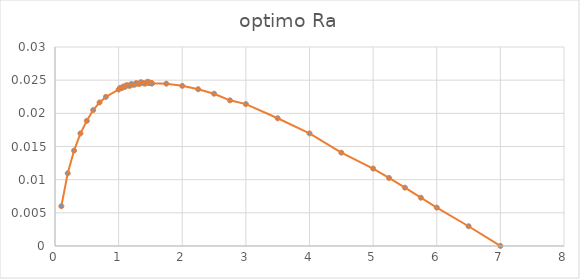
| Category | optimo Ra |
|---|---|
| 0.1 | 0.006 |
| 0.2 | 0.011 |
| 0.3 | 0.014 |
| 0.4 | 0.017 |
| 0.5 | 0.019 |
| 0.6 | 0.02 |
| 0.7 | 0.022 |
| 0.8 | 0.022 |
| 1.0 | 0.024 |
| 1.025 | 0.024 |
| 1.05 | 0.024 |
| 1.075 | 0.024 |
| 1.1 | 0.024 |
| 1.125 | 0.024 |
| 1.15 | 0.024 |
| 1.175 | 0.024 |
| 1.2 | 0.024 |
| 1.225 | 0.024 |
| 1.25 | 0.024 |
| 1.275 | 0.025 |
| 1.3 | 0.024 |
| 1.325 | 0.024 |
| 1.35 | 0.025 |
| 1.375 | 0.025 |
| 1.4 | 0.024 |
| 1.425 | 0.024 |
| 1.45 | 0.025 |
| 1.465 | 0.025 |
| 1.475 | 0.025 |
| 1.48 | 0.025 |
| 1.485 | 0.025 |
| 1.495 | 0.025 |
| 1.5 | 0.025 |
| 1.505 | 0.025 |
| 1.51 | 0.025 |
| 1.515 | 0.025 |
| 1.52 | 0.025 |
| 1.525 | 0.025 |
| 1.75 | 0.024 |
| 2.0 | 0.024 |
| 2.25 | 0.024 |
| 2.5 | 0.023 |
| 2.75 | 0.022 |
| 3.0 | 0.021 |
| 3.5 | 0.019 |
| 4.0 | 0.017 |
| 4.5 | 0.014 |
| 5.0 | 0.012 |
| 5.25 | 0.01 |
| 5.5 | 0.009 |
| 5.75 | 0.007 |
| 6.0 | 0.006 |
| 6.5 | 0.003 |
| 7.0 | 0 |